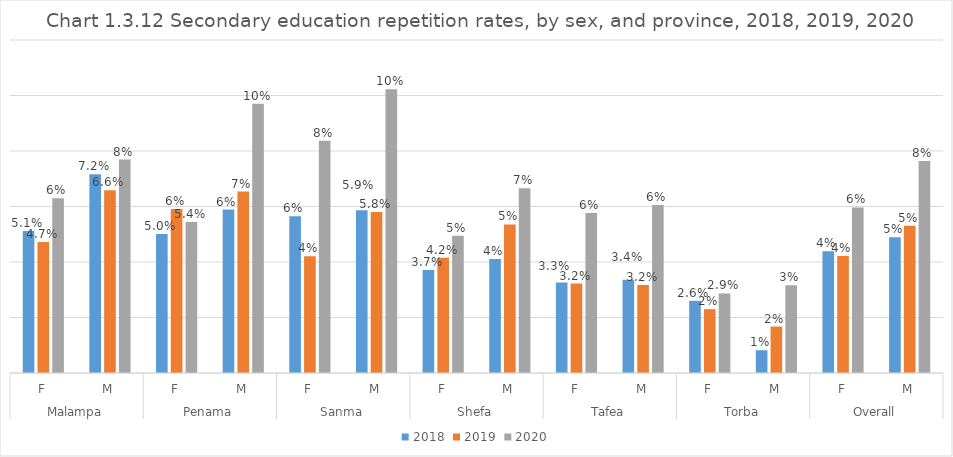
| Category | 2018 | 2019 | 2020 |
|---|---|---|---|
| 0 | 0.051 | 0.047 | 0.063 |
| 1 | 0.072 | 0.066 | 0.077 |
| 2 | 0.05 | 0.059 | 0.054 |
| 3 | 0.059 | 0.065 | 0.097 |
| 4 | 0.056 | 0.042 | 0.084 |
| 5 | 0.059 | 0.058 | 0.102 |
| 6 | 0.037 | 0.042 | 0.049 |
| 7 | 0.041 | 0.054 | 0.067 |
| 8 | 0.033 | 0.032 | 0.058 |
| 9 | 0.034 | 0.032 | 0.061 |
| 10 | 0.026 | 0.023 | 0.029 |
| 11 | 0.008 | 0.017 | 0.032 |
| 12 | 0.044 | 0.042 | 0.06 |
| 13 | 0.049 | 0.053 | 0.076 |